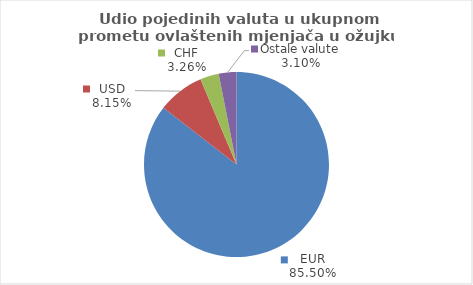
| Category | Series 0 |
|---|---|
| EUR | 85.497 |
| USD | 8.15 |
| CHF | 3.257 |
| Ostale valute | 3.097 |